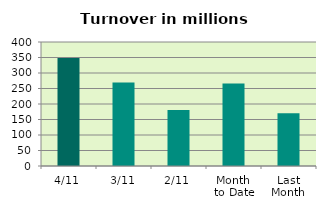
| Category | Series 0 |
|---|---|
| 4/11 | 348.023 |
| 3/11 | 269.419 |
| 2/11 | 180.45 |
| Month 
to Date | 265.964 |
| Last
Month | 170.355 |